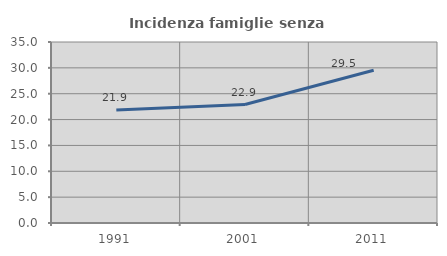
| Category | Incidenza famiglie senza nuclei |
|---|---|
| 1991.0 | 21.872 |
| 2001.0 | 22.913 |
| 2011.0 | 29.534 |